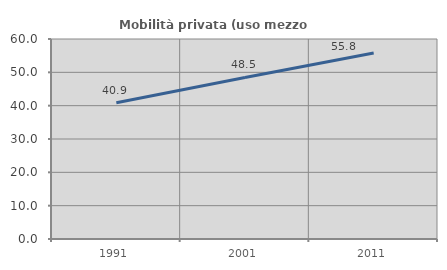
| Category | Mobilità privata (uso mezzo privato) |
|---|---|
| 1991.0 | 40.87 |
| 2001.0 | 48.459 |
| 2011.0 | 55.791 |